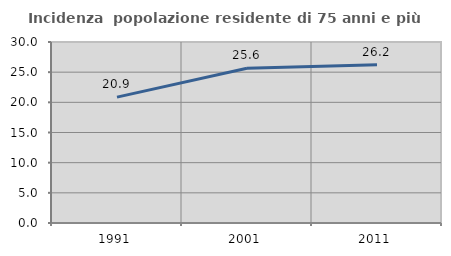
| Category | Incidenza  popolazione residente di 75 anni e più |
|---|---|
| 1991.0 | 20.861 |
| 2001.0 | 25.641 |
| 2011.0 | 26.218 |